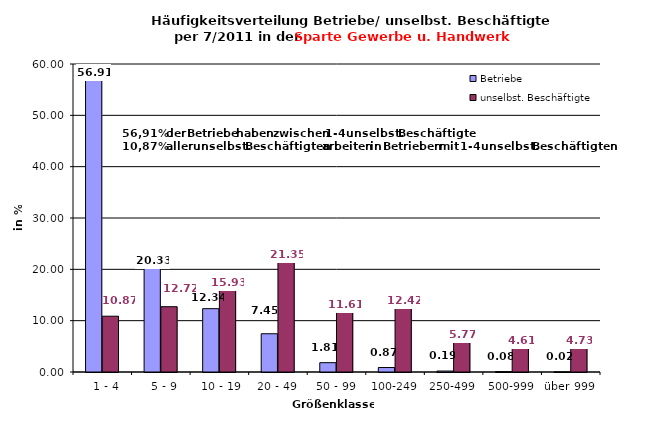
| Category | Betriebe | unselbst. Beschäftigte |
|---|---|---|
|   1 - 4 | 56.907 | 10.867 |
|   5 - 9 | 20.325 | 12.722 |
|  10 - 19 | 12.338 | 15.927 |
| 20 - 49 | 7.453 | 21.345 |
| 50 - 99 | 1.814 | 11.611 |
| 100-249 | 0.872 | 12.424 |
| 250-499 | 0.188 | 5.77 |
| 500-999 | 0.079 | 4.607 |
| über 999 | 0.024 | 4.726 |